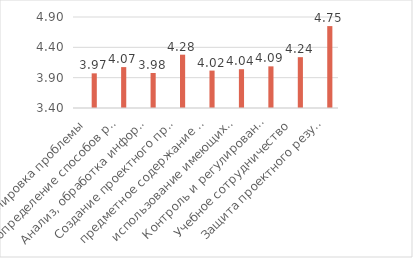
| Category | Series 0 | Series 1 | Series 2 |
|---|---|---|---|
| Формулировка проблемы |  |  | 3.971 |
| определение способов решения проблемы  |  |  | 4.074 |
| Анализ, обработка информации |  |  | 3.977 |
| Создание проектного продукта |  |  | 4.279 |
| предметное содержание проекта  |  |  | 4.017 |
| использование имеющихся способов |  |  | 4.039 |
| Контроль и регулирование проектной де |  |  | 4.086 |
| Учебное сотрудничество |  |  | 4.238 |
| Защита проектного результата |  |  | 4.75 |